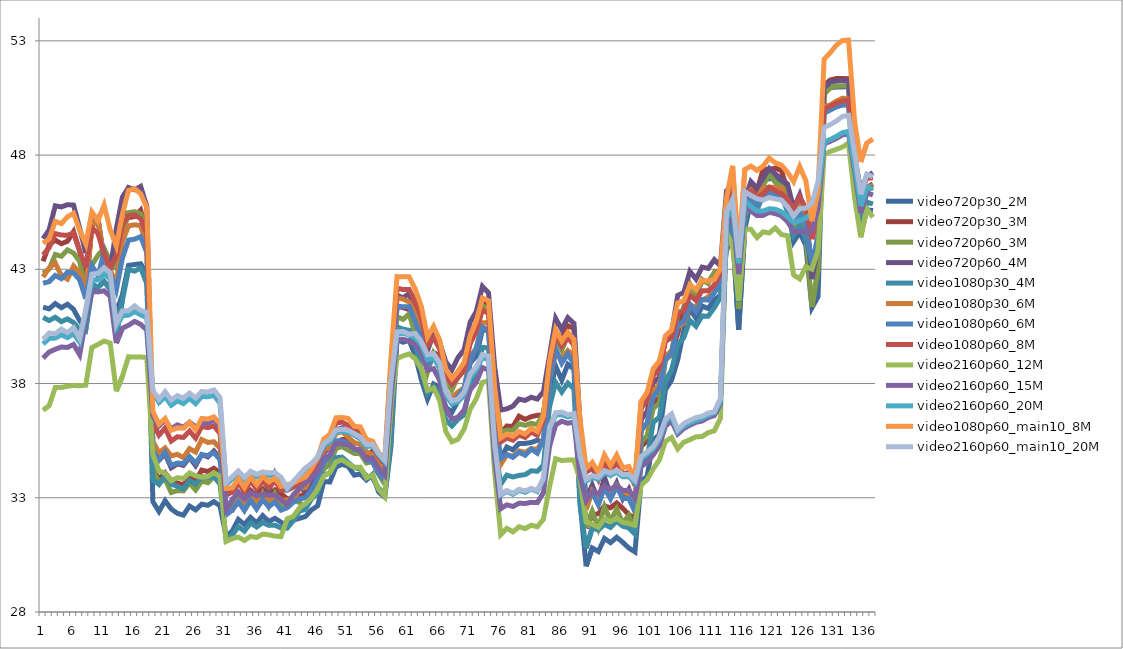
| Category | video720p30_2M | video720p30_3M | video720p60_3M | video720p60_4M | video1080p30_4M | video1080p30_6M | video1080p60_6M | video1080p60_8M | video2160p60_12M | video2160p60_15M | video2160p60_20M | video1080p60_main10_8M | video2160p60_main10_20M |
|---|---|---|---|---|---|---|---|---|---|---|---|---|---|
| 0 | 41.34 | 43.35 | 42.83 | 44.34 | 40.89 | 42.66 | 42.39 | 43.63 | 36.83 | 39.11 | 39.73 | 44.14 | 39.93 |
| 1 | 41.27 | 44.07 | 43.01 | 44.73 | 40.76 | 43.06 | 42.46 | 43.95 | 37.03 | 39.38 | 39.98 | 44.33 | 40.21 |
| 2 | 41.5 | 44.28 | 43.65 | 45.78 | 40.9 | 43.28 | 42.73 | 44.56 | 37.83 | 39.5 | 39.99 | 45.1 | 40.18 |
| 3 | 41.32 | 44.12 | 43.57 | 45.73 | 40.71 | 42.72 | 42.59 | 44.5 | 37.83 | 39.6 | 40.13 | 45 | 40.38 |
| 4 | 41.47 | 44.23 | 43.85 | 45.83 | 40.83 | 42.57 | 42.87 | 44.49 | 37.88 | 39.58 | 40.01 | 45.3 | 40.23 |
| 5 | 41.25 | 44.65 | 43.71 | 45.81 | 40.67 | 43.14 | 42.84 | 44.59 | 37.92 | 39.71 | 40.18 | 45.45 | 40.45 |
| 6 | 40.75 | 43.8 | 43.35 | 44.8 | 40.35 | 42.84 | 42.54 | 43.8 | 37.9 | 39.26 | 39.81 | 44.71 | 39.98 |
| 7 | 40.39 | 42.2 | 42.08 | 43.71 | 40.35 | 41.97 | 41.71 | 43.09 | 37.93 | 40.77 | 41.08 | 44.11 | 41.26 |
| 8 | 42.06 | 44.99 | 43.19 | 45.18 | 42.38 | 44.85 | 43.16 | 44.83 | 39.58 | 42.03 | 42.55 | 45.51 | 42.79 |
| 9 | 42.21 | 45.15 | 43.61 | 45.22 | 42.21 | 45.25 | 42.71 | 44.56 | 39.71 | 42.01 | 42.53 | 45.12 | 42.82 |
| 10 | 42.47 | 43.44 | 43.92 | 43.34 | 42.46 | 43.48 | 43.76 | 43.69 | 39.86 | 42.06 | 42.8 | 45.81 | 43.07 |
| 11 | 42.12 | 42.84 | 43.36 | 42.98 | 42.2 | 42.97 | 42.82 | 43.06 | 39.77 | 41.82 | 42.57 | 44.73 | 42.85 |
| 12 | 41.08 | 44.06 | 43.05 | 44.77 | 40.09 | 42.39 | 42.09 | 43.57 | 37.66 | 39.77 | 40.48 | 44.02 | 40.62 |
| 13 | 41.89 | 45.63 | 44.43 | 46.16 | 41.63 | 44.21 | 43.48 | 44.96 | 38.31 | 40.42 | 40.97 | 45.4 | 41.18 |
| 14 | 43.17 | 45.26 | 45.48 | 46.58 | 42.99 | 44.9 | 44.28 | 45.34 | 39.17 | 40.55 | 40.99 | 46.45 | 41.19 |
| 15 | 43.21 | 45.31 | 45.52 | 46.48 | 42.92 | 44.95 | 44.32 | 45.38 | 39.16 | 40.72 | 41.15 | 46.53 | 41.4 |
| 16 | 43.24 | 45.59 | 45.43 | 46.63 | 43.06 | 44.91 | 44.43 | 45.22 | 39.16 | 40.59 | 41.01 | 46.31 | 41.2 |
| 17 | 42.8 | 44.6 | 44.74 | 45.76 | 42.37 | 44.01 | 43.73 | 44.54 | 39.14 | 40.34 | 40.88 | 45.7 | 41.12 |
| 18 | 32.83 | 34.27 | 34.23 | 35.26 | 33.79 | 35.46 | 35.04 | 36.26 | 34.89 | 36.58 | 37.67 | 36.78 | 37.7 |
| 19 | 32.4 | 33.82 | 33.66 | 34.64 | 33.58 | 34.97 | 34.66 | 35.74 | 34.18 | 36.14 | 37.17 | 36.22 | 37.31 |
| 20 | 32.87 | 34.09 | 33.81 | 34.92 | 33.96 | 35.18 | 34.99 | 36.05 | 34.07 | 36.41 | 37.43 | 36.47 | 37.64 |
| 21 | 32.51 | 33.76 | 33.23 | 34.31 | 33.6 | 34.83 | 34.43 | 35.48 | 33.74 | 36.02 | 37.05 | 35.95 | 37.28 |
| 22 | 32.32 | 33.65 | 33.31 | 34.48 | 33.5 | 34.9 | 34.52 | 35.67 | 33.88 | 36.19 | 37.24 | 36.06 | 37.47 |
| 23 | 32.24 | 33.56 | 33.3 | 34.42 | 33.39 | 34.76 | 34.5 | 35.64 | 33.84 | 36.09 | 37.12 | 36.04 | 37.36 |
| 24 | 32.64 | 33.97 | 33.65 | 34.76 | 33.75 | 35.15 | 34.8 | 35.92 | 34.09 | 36.31 | 37.36 | 36.3 | 37.58 |
| 25 | 32.47 | 33.76 | 33.34 | 34.41 | 33.6 | 35 | 34.52 | 35.61 | 33.96 | 36.11 | 37.12 | 35.98 | 37.37 |
| 26 | 32.72 | 34.21 | 33.73 | 34.89 | 33.92 | 35.55 | 34.88 | 36.12 | 33.9 | 36.26 | 37.44 | 36.47 | 37.65 |
| 27 | 32.67 | 34.15 | 33.66 | 34.79 | 33.89 | 35.42 | 34.85 | 36.07 | 33.93 | 36.25 | 37.42 | 36.45 | 37.63 |
| 28 | 32.83 | 34.29 | 33.93 | 35.05 | 33.91 | 35.45 | 34.97 | 36.15 | 34.1 | 36.42 | 37.48 | 36.54 | 37.72 |
| 29 | 32.65 | 34.1 | 33.61 | 34.7 | 33.63 | 35.17 | 34.67 | 35.81 | 33.93 | 36.08 | 37.14 | 36.25 | 37.39 |
| 30 | 31.3 | 32.49 | 32.28 | 33.12 | 31.18 | 32.39 | 32.25 | 33.18 | 31.09 | 32.49 | 33.57 | 33.41 | 33.68 |
| 31 | 31.54 | 32.64 | 32.51 | 33.26 | 31.36 | 32.44 | 32.46 | 33.24 | 31.21 | 32.93 | 33.82 | 33.43 | 33.92 |
| 32 | 32.05 | 33.25 | 32.98 | 33.85 | 31.74 | 32.88 | 32.83 | 33.67 | 31.28 | 33.23 | 34.06 | 33.83 | 34.17 |
| 33 | 31.83 | 32.99 | 32.62 | 33.4 | 31.54 | 32.63 | 32.44 | 33.26 | 31.13 | 32.94 | 33.78 | 33.45 | 33.89 |
| 34 | 32.14 | 33.33 | 33.13 | 34 | 31.9 | 33.05 | 32.89 | 33.75 | 31.31 | 33.22 | 34.05 | 33.92 | 34.16 |
| 35 | 31.9 | 33.08 | 32.58 | 33.4 | 31.72 | 32.87 | 32.51 | 33.39 | 31.26 | 33.09 | 33.91 | 33.57 | 34.03 |
| 36 | 32.22 | 33.39 | 33.18 | 33.97 | 31.92 | 33.07 | 32.91 | 33.75 | 31.41 | 33.16 | 34.01 | 33.95 | 34.13 |
| 37 | 31.96 | 33.14 | 32.62 | 33.3 | 31.79 | 32.93 | 32.61 | 33.44 | 31.38 | 33.11 | 33.97 | 33.69 | 34.09 |
| 38 | 32.1 | 33.35 | 33.17 | 34.04 | 31.8 | 33.01 | 32.82 | 33.74 | 31.32 | 33.12 | 33.99 | 33.86 | 34.11 |
| 39 | 31.93 | 33.18 | 32.64 | 33.46 | 31.68 | 32.89 | 32.46 | 33.34 | 31.3 | 32.91 | 33.78 | 33.5 | 33.9 |
| 40 | 31.77 | 32.96 | 32.78 | 33.55 | 31.67 | 32.91 | 32.56 | 33.33 | 32.08 | 32.71 | 33.36 | 33.56 | 33.43 |
| 41 | 32.02 | 32.96 | 32.95 | 33.62 | 31.99 | 32.88 | 32.8 | 33.46 | 32.18 | 33.13 | 33.67 | 33.64 | 33.71 |
| 42 | 32.1 | 33.06 | 32.79 | 33.47 | 32.42 | 33.4 | 32.95 | 33.62 | 32.55 | 33.4 | 33.95 | 33.79 | 34.01 |
| 43 | 32.18 | 33.18 | 32.61 | 33.26 | 32.49 | 33.45 | 33 | 33.68 | 32.75 | 33.65 | 34.24 | 33.9 | 34.31 |
| 44 | 32.47 | 33.47 | 33.03 | 33.71 | 32.95 | 33.98 | 33.35 | 34.07 | 32.99 | 33.85 | 34.46 | 34.28 | 34.5 |
| 45 | 32.65 | 33.61 | 33.5 | 34.18 | 33.21 | 34.23 | 33.83 | 34.56 | 33.38 | 34.15 | 34.71 | 34.76 | 34.8 |
| 46 | 33.71 | 34.76 | 34.26 | 34.97 | 34 | 35.11 | 34.52 | 35.23 | 33.95 | 34.74 | 35.27 | 35.57 | 35.38 |
| 47 | 33.69 | 34.74 | 34.47 | 35.19 | 34.08 | 35.16 | 34.8 | 35.56 | 34.1 | 34.86 | 35.44 | 35.78 | 35.56 |
| 48 | 34.35 | 35.43 | 35.16 | 35.96 | 34.75 | 35.83 | 35.48 | 36.27 | 34.57 | 35.38 | 35.89 | 36.5 | 35.97 |
| 49 | 34.46 | 35.55 | 35.24 | 36.06 | 34.78 | 35.89 | 35.5 | 36.31 | 34.66 | 35.36 | 35.91 | 36.52 | 36 |
| 50 | 34.38 | 35.55 | 35.09 | 35.9 | 34.54 | 35.65 | 35.36 | 36.17 | 34.49 | 35.32 | 35.86 | 36.47 | 35.96 |
| 51 | 33.99 | 35.11 | 34.94 | 35.77 | 34.32 | 35.42 | 35.12 | 35.92 | 34.33 | 35.16 | 35.74 | 36.13 | 35.81 |
| 52 | 34.04 | 35.08 | 34.93 | 35.7 | 34.26 | 35.32 | 35.11 | 35.88 | 34.34 | 35.04 | 35.57 | 36.1 | 35.66 |
| 53 | 33.78 | 34.81 | 34.52 | 35.29 | 33.96 | 35.01 | 34.64 | 35.38 | 33.87 | 34.69 | 35.23 | 35.56 | 35.33 |
| 54 | 34.02 | 35.05 | 34.58 | 35.35 | 33.85 | 34.89 | 34.57 | 35.31 | 33.99 | 34.74 | 35.28 | 35.48 | 35.34 |
| 55 | 33.25 | 34.27 | 34.02 | 34.8 | 33.42 | 34.46 | 34.06 | 34.8 | 33.37 | 34.28 | 34.88 | 34.97 | 34.94 |
| 56 | 33.03 | 34.08 | 33.59 | 34.37 | 33.16 | 34.23 | 33.76 | 34.54 | 33.06 | 33.98 | 34.57 | 34.71 | 34.64 |
| 57 | 35.22 | 36.38 | 37.63 | 38.55 | 35.47 | 36.64 | 37.88 | 38.8 | 37.08 | 37.41 | 38.05 | 39.09 | 38.12 |
| 58 | 39.93 | 41.38 | 40.93 | 41.87 | 40.48 | 41.75 | 41.38 | 42.18 | 39.09 | 39.93 | 40.18 | 42.68 | 40.26 |
| 59 | 39.81 | 41.32 | 40.81 | 41.75 | 40.38 | 41.7 | 41.36 | 42.11 | 39.21 | 39.94 | 40.2 | 42.67 | 40.28 |
| 60 | 39.89 | 41.24 | 41.05 | 41.94 | 40.33 | 41.57 | 41.36 | 42.12 | 39.3 | 39.86 | 40.12 | 42.67 | 40.16 |
| 61 | 39.22 | 40.67 | 40.14 | 41.13 | 39.75 | 41.07 | 40.71 | 41.58 | 39.08 | 39.69 | 40.01 | 42.13 | 40.19 |
| 62 | 38.16 | 39.74 | 39.68 | 40.65 | 38.59 | 40.04 | 40.01 | 40.9 | 38.64 | 39.35 | 39.69 | 41.37 | 39.83 |
| 63 | 37.32 | 38.83 | 38.49 | 39.42 | 37.56 | 39.01 | 38.74 | 39.65 | 37.7 | 38.58 | 39.05 | 40.04 | 39.27 |
| 64 | 37.98 | 39.36 | 39.33 | 40.24 | 37.87 | 39.2 | 39.19 | 40 | 37.8 | 38.65 | 39.12 | 40.5 | 39.31 |
| 65 | 37.83 | 39.21 | 38.89 | 39.8 | 37.58 | 38.91 | 38.64 | 39.51 | 37.26 | 38.14 | 38.7 | 39.9 | 38.9 |
| 66 | 36.97 | 38.22 | 38.06 | 38.95 | 36.4 | 37.66 | 37.5 | 38.36 | 35.9 | 36.9 | 37.53 | 38.63 | 37.68 |
| 67 | 36.74 | 37.97 | 37.72 | 38.6 | 36.14 | 37.37 | 37.13 | 37.97 | 35.45 | 36.44 | 37.1 | 38.22 | 37.24 |
| 68 | 37.24 | 38.42 | 38.31 | 39.14 | 36.43 | 37.63 | 37.43 | 38.25 | 35.56 | 36.53 | 37.2 | 38.53 | 37.32 |
| 69 | 37.48 | 38.65 | 38.61 | 39.48 | 36.63 | 37.81 | 37.78 | 38.59 | 36 | 36.84 | 37.5 | 38.93 | 37.63 |
| 70 | 38.9 | 40.02 | 39.88 | 40.69 | 38.01 | 39.17 | 38.98 | 39.75 | 36.88 | 37.72 | 38.28 | 40.1 | 38.42 |
| 71 | 39.2 | 40.36 | 40.35 | 41.16 | 38.41 | 39.55 | 39.56 | 40.29 | 37.33 | 38.06 | 38.6 | 40.73 | 38.74 |
| 72 | 40.35 | 41.51 | 41.42 | 42.25 | 39.58 | 40.66 | 40.47 | 41.22 | 38.05 | 38.7 | 39.13 | 41.74 | 39.27 |
| 73 | 40.32 | 41.5 | 41.16 | 41.97 | 39.56 | 40.67 | 40.33 | 41.07 | 38.11 | 38.59 | 39.05 | 41.62 | 39.2 |
| 74 | 36.35 | 37.58 | 37.83 | 38.75 | 35.39 | 36.47 | 36.81 | 37.58 | 34.12 | 34.73 | 35.33 | 37.88 | 35.39 |
| 75 | 34.69 | 35.79 | 35.89 | 36.84 | 33.59 | 34.46 | 34.72 | 35.44 | 31.39 | 32.52 | 33.12 | 35.62 | 33.16 |
| 76 | 35.22 | 36.14 | 35.95 | 36.89 | 33.99 | 34.88 | 34.89 | 35.62 | 31.66 | 32.69 | 33.28 | 35.79 | 33.32 |
| 77 | 35.1 | 36.12 | 35.95 | 37.01 | 33.91 | 34.82 | 34.77 | 35.52 | 31.51 | 32.62 | 33.15 | 35.69 | 33.2 |
| 78 | 35.38 | 36.57 | 36.24 | 37.32 | 33.98 | 35.05 | 34.99 | 35.75 | 31.73 | 32.76 | 33.32 | 35.9 | 33.37 |
| 79 | 35.38 | 36.43 | 36.17 | 37.26 | 34.01 | 34.98 | 34.86 | 35.64 | 31.65 | 32.75 | 33.24 | 35.79 | 33.3 |
| 80 | 35.42 | 36.55 | 36.26 | 37.4 | 34.18 | 35.15 | 35.13 | 35.88 | 31.8 | 32.8 | 33.38 | 36.04 | 33.41 |
| 81 | 35.52 | 36.61 | 36.2 | 37.32 | 34.16 | 35.12 | 34.95 | 35.73 | 31.73 | 32.79 | 33.27 | 35.9 | 33.32 |
| 82 | 35.43 | 36.63 | 36.71 | 37.64 | 34.42 | 35.55 | 35.56 | 36.39 | 32.06 | 33.22 | 33.8 | 36.58 | 33.86 |
| 83 | 37.54 | 38.68 | 38.55 | 39.23 | 36.98 | 38.2 | 38.04 | 38.79 | 33.48 | 35.25 | 35.98 | 39 | 36.08 |
| 84 | 38.77 | 40.33 | 40.04 | 40.85 | 38.05 | 39.29 | 39.53 | 40.17 | 34.71 | 36.19 | 36.63 | 40.36 | 36.72 |
| 85 | 38.15 | 39.91 | 39.47 | 40.37 | 37.63 | 39.09 | 38.89 | 39.64 | 34.63 | 36.35 | 36.64 | 39.86 | 36.75 |
| 86 | 38.84 | 40.53 | 40.09 | 40.88 | 38.02 | 39.44 | 39.3 | 40.01 | 34.65 | 36.26 | 36.54 | 40.24 | 36.63 |
| 87 | 38.63 | 40.41 | 39.72 | 40.63 | 37.76 | 39.2 | 38.85 | 39.68 | 34.65 | 36.32 | 36.6 | 39.93 | 36.69 |
| 88 | 32.82 | 35.03 | 34.99 | 36.3 | 32.67 | 34.61 | 35.04 | 36.24 | 33.78 | 33.93 | 34.77 | 36.43 | 34.85 |
| 89 | 30 | 31.67 | 31.71 | 32.89 | 30.79 | 32.49 | 32.9 | 34.12 | 31.94 | 32.86 | 33.73 | 34.29 | 33.81 |
| 90 | 30.8 | 32.26 | 32.41 | 33.55 | 31.68 | 33.31 | 33.24 | 34.29 | 31.84 | 33.26 | 33.88 | 34.55 | 33.97 |
| 91 | 30.65 | 32.3 | 31.68 | 32.88 | 31.58 | 33.04 | 32.69 | 33.8 | 31.71 | 33.18 | 33.81 | 34.11 | 33.9 |
| 92 | 31.22 | 32.64 | 32.61 | 33.9 | 31.84 | 33.42 | 33.44 | 34.58 | 32.08 | 33.51 | 34.09 | 34.87 | 34.19 |
| 93 | 31.04 | 32.56 | 31.99 | 33.15 | 31.7 | 33.25 | 32.95 | 34.06 | 31.96 | 33.38 | 33.98 | 34.4 | 34.08 |
| 94 | 31.27 | 32.77 | 32.51 | 33.66 | 31.98 | 33.57 | 33.49 | 34.61 | 32.1 | 33.53 | 34.12 | 34.87 | 34.21 |
| 95 | 31.05 | 32.54 | 31.89 | 32.95 | 31.75 | 33.3 | 32.96 | 34.04 | 31.92 | 33.32 | 33.92 | 34.31 | 34.02 |
| 96 | 30.8 | 32.26 | 32.23 | 33.38 | 31.68 | 33.11 | 32.97 | 34.11 | 31.87 | 33.32 | 33.92 | 34.37 | 34.02 |
| 97 | 30.63 | 32.1 | 31.48 | 32.61 | 31.41 | 32.87 | 32.38 | 33.54 | 31.8 | 32.99 | 33.66 | 33.77 | 33.77 |
| 98 | 33.72 | 35.23 | 35.46 | 36.43 | 34.53 | 35.94 | 35.97 | 36.91 | 33.55 | 34.36 | 34.71 | 37.22 | 34.8 |
| 99 | 33.93 | 35.5 | 35.71 | 36.78 | 34.73 | 36.24 | 36.28 | 37.29 | 33.79 | 34.56 | 34.91 | 37.62 | 35.01 |
| 100 | 35.54 | 37.17 | 36.91 | 38.05 | 36.3 | 37.71 | 37.42 | 38.35 | 34.27 | 34.88 | 35.14 | 38.65 | 35.24 |
| 101 | 35.75 | 37.36 | 37.14 | 38.27 | 36.53 | 37.93 | 37.78 | 38.65 | 34.66 | 35.28 | 35.56 | 38.99 | 35.67 |
| 102 | 37.73 | 39.15 | 39.03 | 40.05 | 38.12 | 39.22 | 39.09 | 39.85 | 35.47 | 36.14 | 36.33 | 40.09 | 36.45 |
| 103 | 38.15 | 39.39 | 39.26 | 40.23 | 38.59 | 39.43 | 39.31 | 40.02 | 35.64 | 36.36 | 36.56 | 40.34 | 36.67 |
| 104 | 39.03 | 40.18 | 41.09 | 41.86 | 39.71 | 40.5 | 40.57 | 41.05 | 35.14 | 35.79 | 35.89 | 41.53 | 35.98 |
| 105 | 40.32 | 41.33 | 41.25 | 41.99 | 40.01 | 40.64 | 40.72 | 41.18 | 35.43 | 36.03 | 36.14 | 41.62 | 36.25 |
| 106 | 41.29 | 42.31 | 42.35 | 42.91 | 40.76 | 41.41 | 41.48 | 41.87 | 35.54 | 36.18 | 36.28 | 42.33 | 36.39 |
| 107 | 40.85 | 41.87 | 41.8 | 42.57 | 40.51 | 41.37 | 41.15 | 41.64 | 35.67 | 36.3 | 36.39 | 42.11 | 36.51 |
| 108 | 41.39 | 42.49 | 42.56 | 43.1 | 40.96 | 41.66 | 41.68 | 42.06 | 35.68 | 36.36 | 36.48 | 42.53 | 36.57 |
| 109 | 41.29 | 42.43 | 42.38 | 43.04 | 40.95 | 41.79 | 41.65 | 42.06 | 35.85 | 36.51 | 36.61 | 42.48 | 36.71 |
| 110 | 41.66 | 42.84 | 42.85 | 43.42 | 41.32 | 42.1 | 41.96 | 42.31 | 35.93 | 36.6 | 36.72 | 42.56 | 36.76 |
| 111 | 41.87 | 42.96 | 42.48 | 43.15 | 41.77 | 42.44 | 42.42 | 42.78 | 36.47 | 37.09 | 37.2 | 43.04 | 37.35 |
| 112 | 43.8 | 44.9 | 45.96 | 46.44 | 44.11 | 44.99 | 44.91 | 45.52 | 44.62 | 44.9 | 45.24 | 46.11 | 45.49 |
| 113 | 44.6 | 45.78 | 46.07 | 46.73 | 45.06 | 45.97 | 45.89 | 46.44 | 43.99 | 45.3 | 45.65 | 47.53 | 46.07 |
| 114 | 40.35 | 41.92 | 41.27 | 42.25 | 41.57 | 42.75 | 42.15 | 42.93 | 41.63 | 42.79 | 43.27 | 43.53 | 43.52 |
| 115 | 44.75 | 45.9 | 45.26 | 46.03 | 45.51 | 46.26 | 45.76 | 46.33 | 44.76 | 45.7 | 45.99 | 47.37 | 46.4 |
| 116 | 46.01 | 46.7 | 46.2 | 46.84 | 45.94 | 46.47 | 46.13 | 46.43 | 44.75 | 45.56 | 45.75 | 47.52 | 46.23 |
| 117 | 45.62 | 46.41 | 45.9 | 46.56 | 45.61 | 46.12 | 45.86 | 46.15 | 44.39 | 45.35 | 45.56 | 47.33 | 46.09 |
| 118 | 46.93 | 47.39 | 46.65 | 46.99 | 46.24 | 46.56 | 46.06 | 46.31 | 44.64 | 45.36 | 45.55 | 47.52 | 46.03 |
| 119 | 46.96 | 47.37 | 47.18 | 47.42 | 46.28 | 46.6 | 46.37 | 46.58 | 44.59 | 45.49 | 45.65 | 47.87 | 46.14 |
| 120 | 46.98 | 47.43 | 46.8 | 47.17 | 46.27 | 46.59 | 46.23 | 46.44 | 44.81 | 45.44 | 45.63 | 47.66 | 46.08 |
| 121 | 46.86 | 47.32 | 46.63 | 46.96 | 46.25 | 46.55 | 46.09 | 46.31 | 44.52 | 45.34 | 45.52 | 47.56 | 46.03 |
| 122 | 45.84 | 46.44 | 46.37 | 46.74 | 45.51 | 45.9 | 45.86 | 46.09 | 44.47 | 45.09 | 45.3 | 47.25 | 45.74 |
| 123 | 44.21 | 45.3 | 44.85 | 45.67 | 44.5 | 45.29 | 45.08 | 45.63 | 42.75 | 44.66 | 45.05 | 46.84 | 45.33 |
| 124 | 44.62 | 45.99 | 45.31 | 46.27 | 44.92 | 45.93 | 45.53 | 46.16 | 42.58 | 44.65 | 45.13 | 47.5 | 45.66 |
| 125 | 44.04 | 45.36 | 44.46 | 45.41 | 44.33 | 45.46 | 44.95 | 45.68 | 43.11 | 44.65 | 45.24 | 46.88 | 45.68 |
| 126 | 41.32 | 43 | 41.36 | 42.57 | 43.29 | 44.74 | 43.25 | 44.32 | 43.01 | 44.69 | 45.45 | 45.11 | 45.9 |
| 127 | 41.8 | 43.47 | 42.98 | 44.08 | 43.71 | 45.16 | 44.41 | 45.45 | 43.83 | 45.65 | 46.29 | 46.46 | 46.84 |
| 128 | 50.68 | 51.07 | 50.67 | 50.94 | 49.86 | 50.13 | 49.84 | 50.02 | 48.03 | 48.49 | 48.57 | 52.19 | 49.21 |
| 129 | 50.95 | 51.28 | 50.95 | 51.19 | 49.97 | 50.19 | 49.98 | 50.14 | 48.16 | 48.6 | 48.68 | 52.48 | 49.33 |
| 130 | 50.98 | 51.35 | 51.03 | 51.25 | 50.11 | 50.36 | 50.12 | 50.27 | 48.25 | 48.73 | 48.82 | 52.81 | 49.49 |
| 131 | 50.98 | 51.35 | 51.02 | 51.25 | 50.21 | 50.49 | 50.19 | 50.36 | 48.35 | 48.88 | 48.98 | 53.02 | 49.69 |
| 132 | 51.01 | 51.34 | 51.06 | 51.28 | 50.17 | 50.45 | 50.24 | 50.41 | 48.52 | 48.93 | 49.04 | 53.03 | 49.74 |
| 133 | 46.39 | 47.32 | 47.31 | 47.92 | 46.79 | 47.49 | 47.51 | 47.88 | 46.12 | 47.26 | 47.53 | 49.45 | 48.1 |
| 134 | 44.6 | 45.67 | 45.83 | 46.46 | 44.87 | 45.71 | 45.87 | 46.34 | 44.4 | 45.47 | 45.77 | 47.7 | 46.28 |
| 135 | 45.61 | 46.59 | 46.46 | 47.06 | 45.94 | 46.61 | 46.59 | 46.99 | 45.64 | 46.35 | 46.6 | 48.53 | 47.17 |
| 136 | 45.57 | 46.73 | 46.58 | 47.23 | 45.86 | 46.66 | 46.57 | 47.01 | 45.28 | 46.25 | 46.52 | 48.7 | 47.05 |